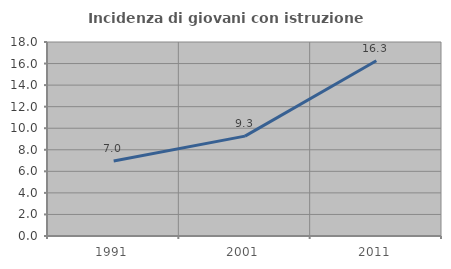
| Category | Incidenza di giovani con istruzione universitaria |
|---|---|
| 1991.0 | 6.962 |
| 2001.0 | 9.268 |
| 2011.0 | 16.26 |